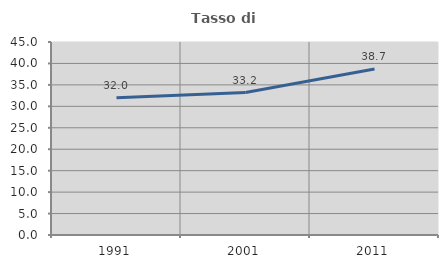
| Category | Tasso di occupazione   |
|---|---|
| 1991.0 | 31.995 |
| 2001.0 | 33.206 |
| 2011.0 | 38.705 |